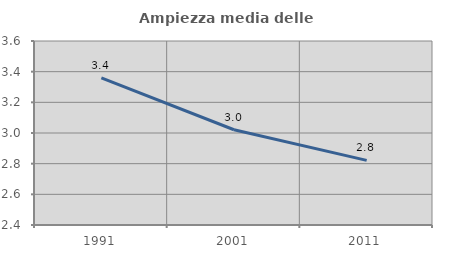
| Category | Ampiezza media delle famiglie |
|---|---|
| 1991.0 | 3.36 |
| 2001.0 | 3.021 |
| 2011.0 | 2.821 |